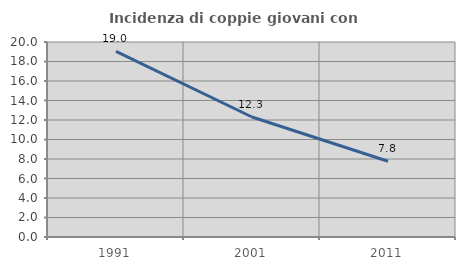
| Category | Incidenza di coppie giovani con figli |
|---|---|
| 1991.0 | 19.034 |
| 2001.0 | 12.305 |
| 2011.0 | 7.768 |